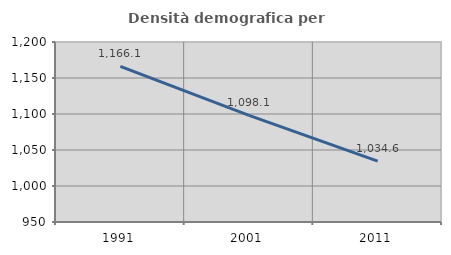
| Category | Densità demografica |
|---|---|
| 1991.0 | 1166.124 |
| 2001.0 | 1098.105 |
| 2011.0 | 1034.618 |